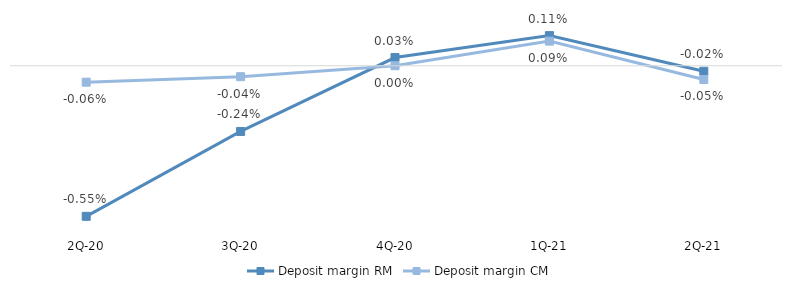
| Category | Deposit margin RM | Deposit margin CM |
|---|---|---|
| 2Q-21 | 0 | 0 |
| 1Q-21 | 0.001 | 0.001 |
| 4Q-20 | 0 | 0 |
| 3Q-20 | -0.002 | 0 |
| 2Q-20 | -0.006 | -0.001 |